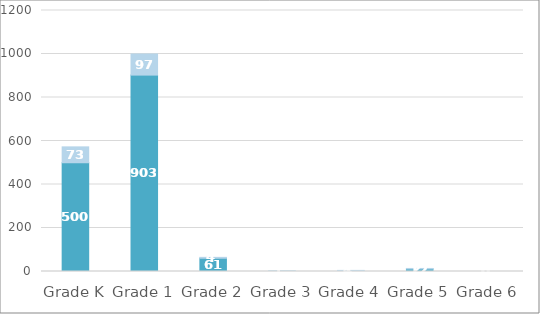
| Category | TA | BA |
|---|---|---|
| Grade K | 500 | 73 |
| Grade 1 | 903 | 97 |
| Grade 2 | 61 | 4 |
| Grade 3 | 1 | 1 |
| Grade 4 | 1 | 4 |
| Grade 5 | 12 | 2 |
| Grade 6 | 0 | 0 |